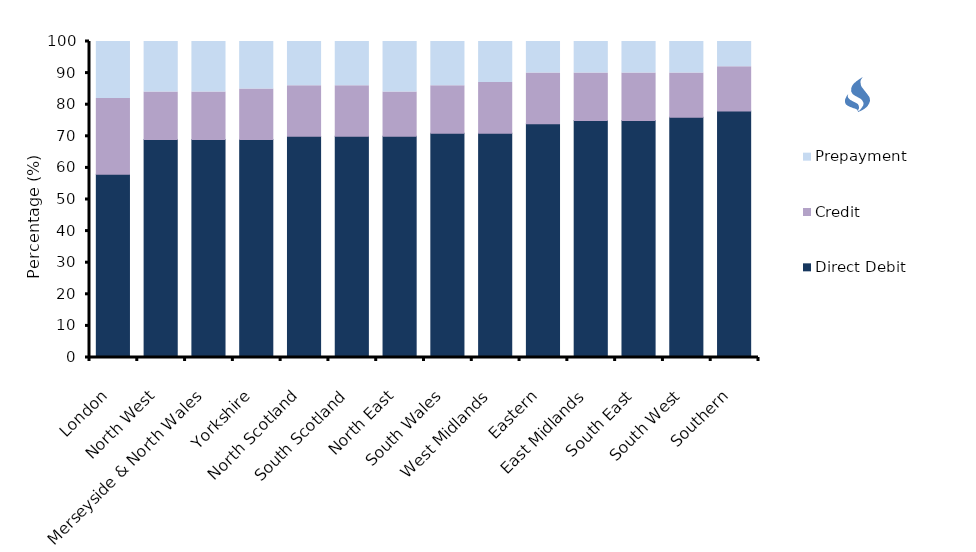
| Category | Direct Debit | Credit | Prepayment |
|---|---|---|---|
| London | 58 | 24 | 18 |
| North West | 69 | 15 | 16 |
| Merseyside & North Wales | 69 | 15 | 16 |
| Yorkshire | 69 | 16 | 15 |
| North Scotland | 70 | 16 | 14 |
| South Scotland | 70 | 16 | 14 |
| North East | 70 | 14 | 16 |
| South Wales | 71 | 15 | 15 |
| West Midlands | 71 | 16 | 13 |
| Eastern | 74 | 16 | 10 |
| East Midlands | 75 | 15 | 10 |
| South East | 75 | 15 | 10 |
| South West | 76 | 14 | 10 |
| Southern | 78 | 14 | 8 |